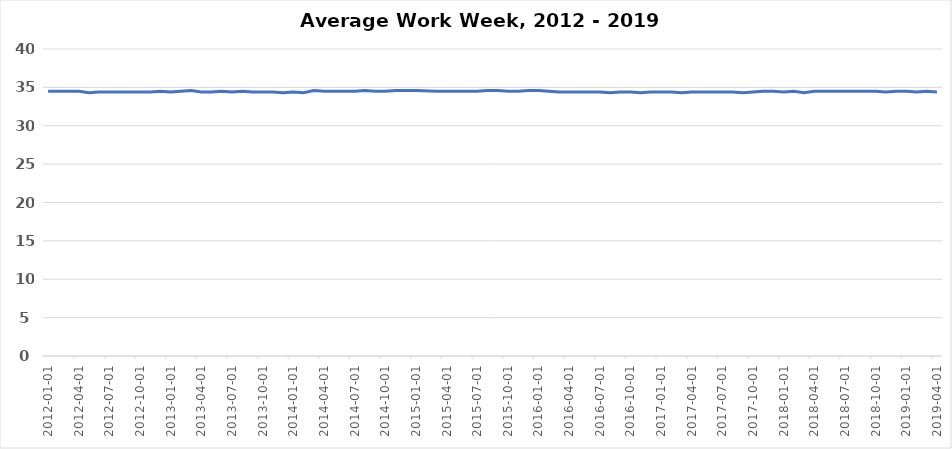
| Category | Series 0 |
|---|---|
| 2012-01-12 | 34.5 |
| 2012-02-11 | 34.5 |
| 2012-03-12 | 34.5 |
| 2012-04-11 | 34.5 |
| 2012-05-11 | 34.3 |
| 2012-06-10 | 34.4 |
| 2012-07-10 | 34.4 |
| 2012-08-09 | 34.4 |
| 2012-09-08 | 34.4 |
| 2012-10-08 | 34.4 |
| 2012-11-07 | 34.4 |
| 2012-12-07 | 34.5 |
| 2013-01-06 | 34.4 |
| 2013-02-05 | 34.5 |
| 2013-03-07 | 34.6 |
| 2013-04-06 | 34.4 |
| 2013-05-06 | 34.4 |
| 2013-06-05 | 34.5 |
| 2013-07-05 | 34.4 |
| 2013-08-04 | 34.5 |
| 2013-09-03 | 34.4 |
| 2013-10-03 | 34.4 |
| 2013-11-02 | 34.4 |
| 2013-12-02 | 34.3 |
| 2014-01-02 | 34.4 |
| 2014-02-03 | 34.3 |
| 2014-03-07 | 34.6 |
| 2014-04-08 | 34.5 |
| 2014-05-10 | 34.5 |
| 2014-06-11 | 34.5 |
| 2014-07-13 | 34.5 |
| 2014-08-14 | 34.6 |
| 2014-09-15 | 34.5 |
| 2014-10-17 | 34.5 |
| 2014-11-18 | 34.6 |
| 2014-12-18 | 34.6 |
| 2015-01-17 | 34.6 |
| 2015-03-18 | 34.5 |
| 2015-04-17 | 34.5 |
| 2015-05-17 | 34.5 |
| 2015-06-16 | 34.5 |
| 2015-07-16 | 34.5 |
| 2015-08-15 | 34.6 |
| 2015-09-14 | 34.6 |
| 2015-10-14 | 34.5 |
| 2015-11-13 | 34.5 |
| 2015-12-13 | 34.6 |
| 2016-01-12 | 34.6 |
| 2016-02-11 | 34.5 |
| 2016-03-12 | 34.4 |
| 2016-04-11 | 34.4 |
| 2016-05-11 | 34.4 |
| 2016-06-10 | 34.4 |
| 2016-07-10 | 34.4 |
| 2016-08-09 | 34.3 |
| 2016-09-08 | 34.4 |
| 2016-10-08 | 34.4 |
| 2016-11-07 | 34.3 |
| 2016-12-07 | 34.4 |
| 2017-01-06 | 34.4 |
| 2017-02-05 | 34.4 |
| 2017-03-07 | 34.3 |
| 2017-04-06 | 34.4 |
| 2017-05-06 | 34.4 |
| 2017-06-05 | 34.4 |
| 2017-07-05 | 34.4 |
| 2017-08-04 | 34.4 |
| 2017-09-03 | 34.3 |
| 2017-10-03 | 34.4 |
| 2017-11-02 | 34.5 |
| 2017-12-02 | 34.5 |
| 2018-01-01 | 34.4 |
| 2018-02-02 | 34.5 |
| 2018-03-06 | 34.3 |
| 2018-04-07 | 34.5 |
| 2018-05-09 | 34.5 |
| 2018-06-10 | 34.5 |
| 2018-07-12 | 34.5 |
| 2018-08-13 | 34.5 |
| 2018-09-14 | 34.5 |
| 2018-10-16 | 34.5 |
| 2018-11-17 | 34.4 |
| 2018-12-19 | 34.5 |
| 2019-01-20 | 34.5 |
| 2019-02-21 | 34.4 |
| 2019-03-25 | 34.5 |
| 2019-04-26 | 34.4 |